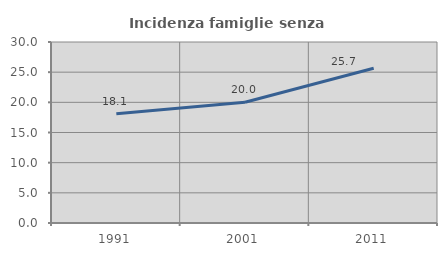
| Category | Incidenza famiglie senza nuclei |
|---|---|
| 1991.0 | 18.106 |
| 2001.0 | 20.023 |
| 2011.0 | 25.654 |